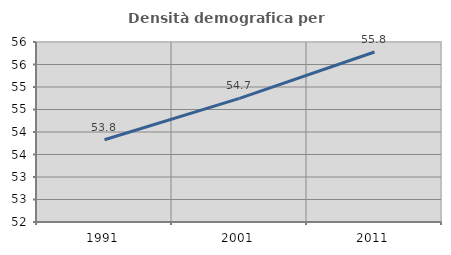
| Category | Densità demografica |
|---|---|
| 1991.0 | 53.829 |
| 2001.0 | 54.746 |
| 2011.0 | 55.778 |